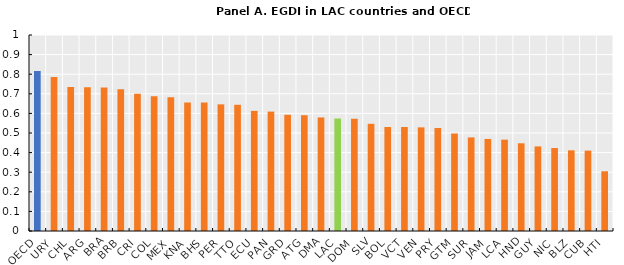
| Category | Series 0 |
|---|---|
| OECD | 0.816 |
| URY | 0.786 |
| CHL | 0.735 |
| ARG | 0.734 |
| BRA | 0.733 |
| BRB | 0.723 |
| CRI | 0.7 |
| COL | 0.687 |
| MEX | 0.682 |
| KNA | 0.655 |
| BHS | 0.655 |
| PER | 0.646 |
| TTO | 0.644 |
| ECU | 0.613 |
| PAN | 0.609 |
| GRD | 0.593 |
| ATG | 0.591 |
| DMA | 0.579 |
| LAC | 0.574 |
| DOM | 0.573 |
| SLV | 0.547 |
| BOL | 0.531 |
| VCT | 0.531 |
| VEN | 0.529 |
| PRY | 0.526 |
| GTM | 0.497 |
| SUR | 0.477 |
| JAM | 0.47 |
| LCA | 0.466 |
| HND | 0.447 |
| GUY | 0.432 |
| NIC | 0.423 |
| BLZ | 0.412 |
| CUB | 0.41 |
| HTI | 0.305 |